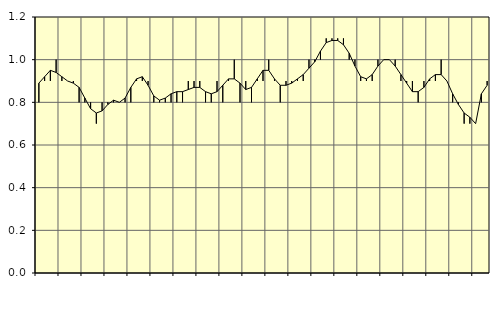
| Category | Piggar | Jordbruk, skogsbruk o fiske, SNI 01-03 |
|---|---|---|
| nan | 0.8 | 0.89 |
| 1.0 | 0.9 | 0.92 |
| 1.0 | 0.9 | 0.95 |
| 1.0 | 1 | 0.94 |
| nan | 0.9 | 0.92 |
| 2.0 | 0.9 | 0.9 |
| 2.0 | 0.9 | 0.89 |
| 2.0 | 0.8 | 0.87 |
| nan | 0.8 | 0.82 |
| 3.0 | 0.8 | 0.77 |
| 3.0 | 0.7 | 0.75 |
| 3.0 | 0.8 | 0.76 |
| nan | 0.8 | 0.79 |
| 4.0 | 0.8 | 0.81 |
| 4.0 | 0.8 | 0.8 |
| 4.0 | 0.8 | 0.82 |
| nan | 0.8 | 0.87 |
| 5.0 | 0.9 | 0.91 |
| 5.0 | 0.9 | 0.92 |
| 5.0 | 0.9 | 0.88 |
| nan | 0.8 | 0.83 |
| 6.0 | 0.8 | 0.81 |
| 6.0 | 0.8 | 0.82 |
| 6.0 | 0.8 | 0.84 |
| nan | 0.8 | 0.85 |
| 7.0 | 0.8 | 0.85 |
| 7.0 | 0.9 | 0.86 |
| 7.0 | 0.9 | 0.87 |
| nan | 0.9 | 0.87 |
| 8.0 | 0.8 | 0.85 |
| 8.0 | 0.8 | 0.84 |
| 8.0 | 0.9 | 0.85 |
| nan | 0.8 | 0.88 |
| 9.0 | 0.9 | 0.91 |
| 9.0 | 1 | 0.91 |
| 9.0 | 0.8 | 0.89 |
| nan | 0.9 | 0.86 |
| 10.0 | 0.8 | 0.87 |
| 10.0 | 0.9 | 0.91 |
| 10.0 | 0.9 | 0.95 |
| nan | 1 | 0.95 |
| 11.0 | 0.9 | 0.91 |
| 11.0 | 0.8 | 0.88 |
| 11.0 | 0.9 | 0.88 |
| nan | 0.9 | 0.89 |
| 12.0 | 0.9 | 0.91 |
| 12.0 | 0.9 | 0.93 |
| 12.0 | 1 | 0.96 |
| nan | 1 | 0.99 |
| 13.0 | 1 | 1.04 |
| 13.0 | 1.1 | 1.08 |
| 13.0 | 1.1 | 1.09 |
| nan | 1.1 | 1.09 |
| 14.0 | 1.1 | 1.07 |
| 14.0 | 1 | 1.03 |
| 14.0 | 1 | 0.97 |
| nan | 0.9 | 0.92 |
| 15.0 | 0.9 | 0.91 |
| 15.0 | 0.9 | 0.93 |
| 15.0 | 1 | 0.97 |
| nan | 1 | 1 |
| 16.0 | 1 | 1 |
| 16.0 | 1 | 0.97 |
| 16.0 | 0.9 | 0.93 |
| nan | 0.9 | 0.89 |
| 17.0 | 0.9 | 0.85 |
| 17.0 | 0.8 | 0.85 |
| 17.0 | 0.9 | 0.87 |
| nan | 0.9 | 0.91 |
| 18.0 | 0.9 | 0.93 |
| 18.0 | 1 | 0.93 |
| 18.0 | 0.9 | 0.9 |
| nan | 0.8 | 0.84 |
| 19.0 | 0.8 | 0.79 |
| 19.0 | 0.7 | 0.75 |
| 19.0 | 0.7 | 0.73 |
| nan | 0.7 | 0.7 |
| 20.0 | 0.8 | 0.84 |
| 20.0 | 0.9 | 0.88 |